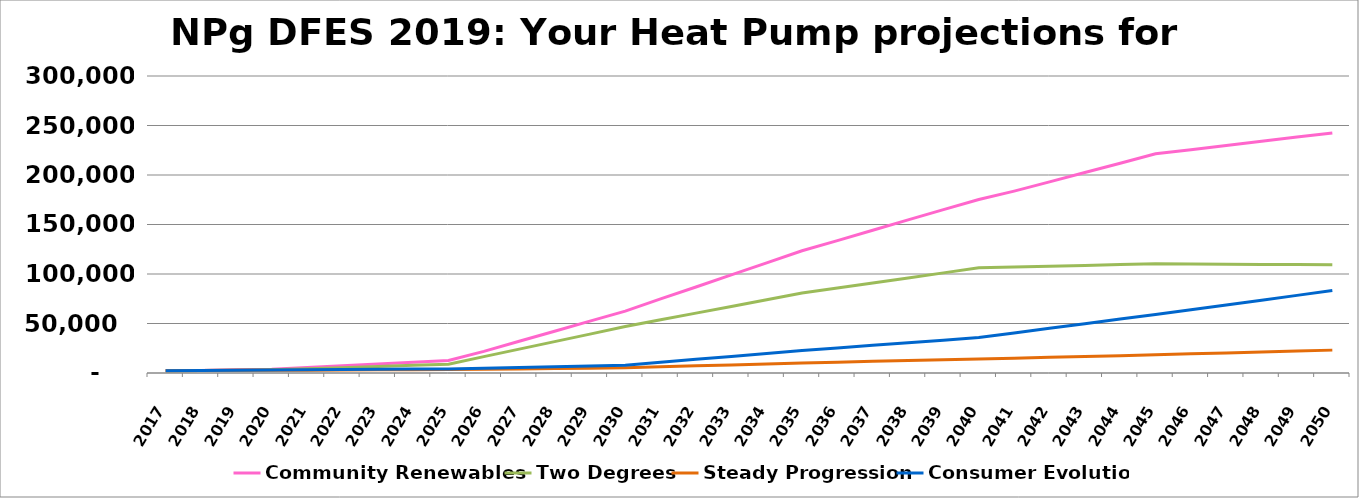
| Category | Community Renewables | Two Degrees | Steady Progression | Consumer Evolution |
|---|---|---|---|---|
| 2017.0 | 2402 | 2372 | 2372 | 2372 |
| 2018.0 | 2570 | 2550 | 2550 | 2550 |
| 2019.0 | 3180 | 2869 | 2652 | 2794 |
| 2020.0 | 3863 | 3216 | 2747 | 3107 |
| 2021.0 | 5520 | 4233 | 2898 | 3301 |
| 2022.0 | 7286 | 5409 | 3057 | 3515 |
| 2023.0 | 9058 | 6526 | 3208 | 3733 |
| 2024.0 | 10811 | 7703 | 3342 | 3942 |
| 2025.0 | 12590 | 8816 | 3490 | 4155 |
| 2026.0 | 21832 | 16525 | 3823 | 4886 |
| 2027.0 | 32030 | 24137 | 4160 | 5643 |
| 2028.0 | 42212 | 31716 | 4493 | 6395 |
| 2029.0 | 52378 | 39300 | 4867 | 7121 |
| 2030.0 | 62504 | 46888 | 5205 | 7869 |
| 2031.0 | 74829 | 53698 | 6210 | 10830 |
| 2032.0 | 86904 | 60475 | 7201 | 13796 |
| 2033.0 | 99128 | 67255 | 8191 | 16764 |
| 2034.0 | 111236 | 74043 | 9181 | 19737 |
| 2035.0 | 123463 | 80831 | 10172 | 22706 |
| 2036.0 | 133767 | 85863 | 10954 | 25326 |
| 2037.0 | 144183 | 90950 | 11751 | 27956 |
| 2038.0 | 154622 | 96044 | 12551 | 30578 |
| 2039.0 | 165012 | 101129 | 13348 | 33203 |
| 2040.0 | 175207 | 106218 | 14129 | 35821 |
| 2041.0 | 183730 | 107046 | 14975 | 40456 |
| 2042.0 | 193011 | 107868 | 15825 | 45131 |
| 2043.0 | 202464 | 108689 | 16673 | 49797 |
| 2044.0 | 211831 | 109518 | 17521 | 54473 |
| 2045.0 | 221388 | 110343 | 18370 | 59153 |
| 2046.0 | 225609 | 110133 | 19320 | 63950 |
| 2047.0 | 229832 | 109920 | 20265 | 68764 |
| 2048.0 | 234059 | 109704 | 21208 | 73577 |
| 2049.0 | 238288 | 109492 | 22157 | 78399 |
| 2050.0 | 242525 | 109274 | 23106 | 83221 |